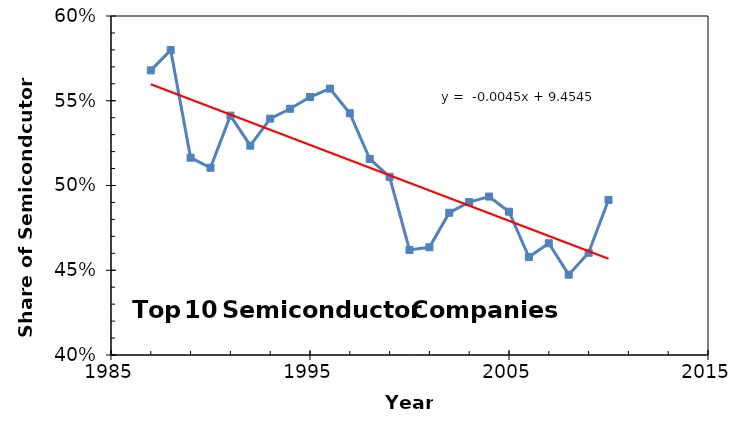
| Category | Series 0 |
|---|---|
| 1987.0 | 0.568 |
| 1988.0 | 0.58 |
| 1989.0 | 0.516 |
| 1990.0 | 0.51 |
| 1991.0 | 0.541 |
| 1992.0 | 0.524 |
| 1993.0 | 0.539 |
| 1994.0 | 0.545 |
| 1995.0 | 0.552 |
| 1996.0 | 0.557 |
| 1997.0 | 0.543 |
| 1998.0 | 0.516 |
| 1999.0 | 0.505 |
| 2000.0 | 0.462 |
| 2001.0 | 0.464 |
| 2002.0 | 0.484 |
| 2003.0 | 0.49 |
| 2004.0 | 0.493 |
| 2005.0 | 0.485 |
| 2006.0 | 0.458 |
| 2007.0 | 0.466 |
| 2008.0 | 0.447 |
| 2009.0 | 0.46 |
| 2010.0 | 0.491 |